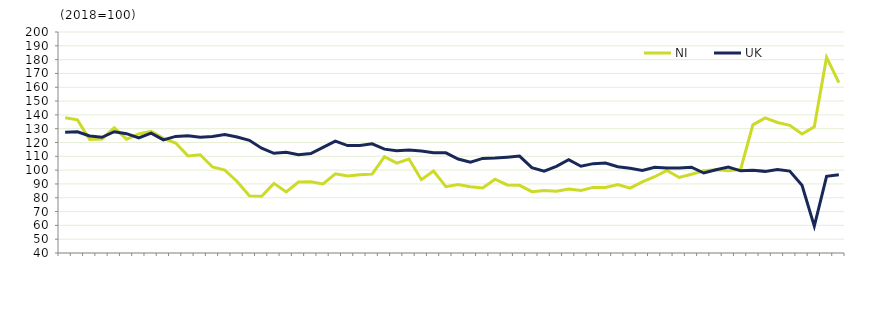
| Category | NI  | UK  |
|---|---|---|
|  | 137.9 | 127.5 |
| Q2 2005 | 136.4 | 127.8 |
|  | 122.2 | 124.7 |
| Q4 2005 | 122.6 | 123.8 |
|  | 130.6 | 127.8 |
| Q2 2006 | 122.4 | 126.4 |
|  | 126.2 | 123.3 |
| Q4 2006 | 128.1 | 126.8 |
|  | 123 | 121.9 |
| Q2 2007 | 119.6 | 124.4 |
|  | 110.3 | 124.9 |
| Q4 2007 | 111.1 | 123.8 |
|  | 102.3 | 124.4 |
| Q2 2008 | 100 | 125.8 |
|  | 91.8 | 124 |
| Q4 2008 | 81.5 | 121.6 |
|  | 81.1 | 115.9 |
| Q2 2009 | 90.4 | 112.2 |
|  | 84.2 | 113 |
| Q4 2009 | 91.4 | 111.1 |
|  | 91.6 | 112 |
| Q2 2010 | 90 | 116.5 |
|  | 97.3 | 121 |
| Q4 2010 | 95.7 | 117.8 |
|  | 96.6 | 117.8 |
| Q2 2011 | 97.1 | 119 |
|  | 109.8 | 115.2 |
| Q4 2011 | 105.1 | 114 |
|  | 108 | 114.5 |
| Q2 2012 | 93.1 | 113.9 |
|  | 99.3 | 112.6 |
| Q4 2012 | 88 | 112.5 |
|  | 89.6 | 108 |
| Q2 2013 | 87.9 | 105.7 |
|  | 87.1 | 108.5 |
| Q4 2013 | 93.4 | 108.7 |
|  | 89.3 | 109.4 |
| Q2 2014 | 89 | 110.2 |
|  | 84.4 | 101.8 |
| Q4 2014 | 85.2 | 99.3 |
|  | 84.7 | 102.7 |
| Q2 2015 | 86.4 | 107.5 |
|  | 85.3 | 102.8 |
| Q4 2015 | 87.5 | 104.7 |
|  | 87.5 | 105.2 |
| Q2 2016 | 89.5 | 102.5 |
|  | 87 | 101.3 |
| Q4 2016 | 91.5 | 99.8 |
|  | 95.2 | 102.1 |
| Q2 2017 | 99.8 | 101.6 |
|  | 94.7 | 101.5 |
| Q4 2017 | 97 | 102.1 |
|  | 99.5 | 97.9 |
| Q2 2018 | 100.3 | 100.3 |
|  | 99.5 | 102.2 |
| Q4 2018 | 100.6 | 99.5 |
|  | 132.8 | 99.9 |
| Q2 2019 | 137.8 | 99.1 |
|  | 134.5 | 100.5 |
| Q4 2019 | 132.4 | 99.3 |
|  | 126.1 | 89 |
| Q2 2020 | 131.4 | 59.5 |
|  | 181.7 | 95.5 |
| Q4 2020 | 163.3 | 96.6 |